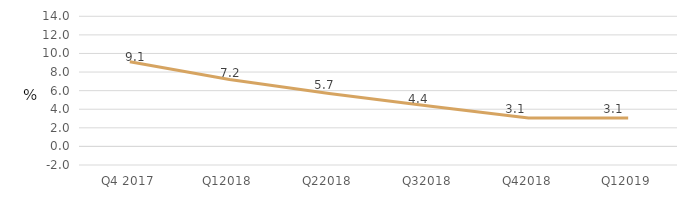
| Category | Series 0 |
|---|---|
| Q4 2017 | 9.1 |
| Q12018 | 7.204 |
| Q22018 | 5.694 |
| Q32018 | 4.358 |
| Q42018 | 3.069 |
| Q12019 | 3.053 |